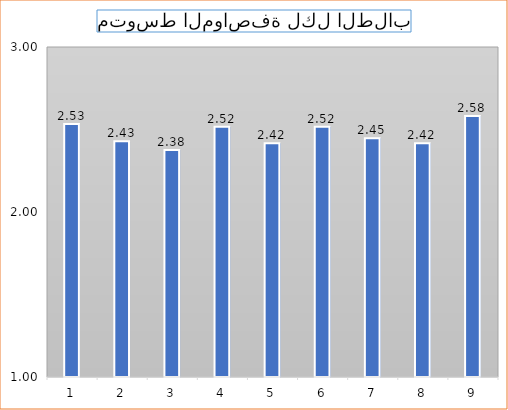
| Category | Series 0 |
|---|---|
| 0 | 2.533 |
| 1 | 2.428 |
| 2 | 2.376 |
| 3 | 2.517 |
| 4 | 2.416 |
| 5 | 2.517 |
| 6 | 2.447 |
| 7 | 2.416 |
| 8 | 2.581 |